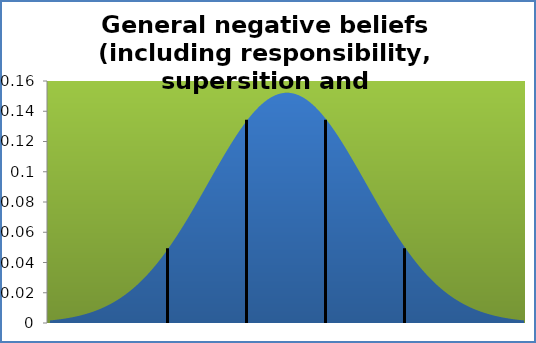
| Category | Series 1 |
|---|---|
| 0.47999999999999865 | 0.002 |
| 0.6109999999999989 | 0.002 |
| 0.7419999999999991 | 0.002 |
| 0.8729999999999993 | 0.003 |
| 1.0039999999999996 | 0.003 |
| 1.1349999999999998 | 0.003 |
| 1.2659999999999991 | 0.004 |
| 1.3969999999999994 | 0.005 |
| 1.5279999999999996 | 0.005 |
| 1.6589999999999998 | 0.006 |
| 1.79 | 0.007 |
| 1.9210000000000003 | 0.008 |
| 2.0519999999999996 | 0.009 |
| 2.183 | 0.01 |
| 2.313999999999999 | 0.011 |
| 2.4449999999999994 | 0.012 |
| 2.5759999999999996 | 0.014 |
| 2.706999999999999 | 0.015 |
| 2.837999999999999 | 0.017 |
| 2.9689999999999994 | 0.019 |
| 3.0999999999999996 | 0.021 |
| 3.231 | 0.023 |
| 3.362 | 0.025 |
| 3.4930000000000003 | 0.028 |
| 3.6239999999999997 | 0.03 |
| 3.755 | 0.033 |
| 3.886 | 0.036 |
| 4.0169999999999995 | 0.039 |
| 4.148 | 0.042 |
| 4.279 | 0.046 |
| 4.409999999999999 | 0.049 |
| 4.5409999999999995 | 0.053 |
| 4.672 | 0.057 |
| 4.802999999999999 | 0.061 |
| 4.933999999999999 | 0.065 |
| 5.0649999999999995 | 0.07 |
| 5.196 | 0.074 |
| 5.327 | 0.079 |
| 5.458 | 0.083 |
| 5.5889999999999995 | 0.088 |
| 5.72 | 0.092 |
| 5.851 | 0.097 |
| 5.981999999999999 | 0.102 |
| 6.1129999999999995 | 0.106 |
| 6.244 | 0.111 |
| 6.375 | 0.115 |
| 6.506 | 0.119 |
| 6.637 | 0.123 |
| 6.768 | 0.127 |
| 6.899 | 0.131 |
| 7.029999999999999 | 0.134 |
| 7.161 | 0.138 |
| 7.292 | 0.141 |
| 7.423 | 0.143 |
| 7.554 | 0.146 |
| 7.685 | 0.148 |
| 7.816 | 0.149 |
| 7.947 | 0.151 |
| 8.078 | 0.152 |
| 8.209 | 0.152 |
| 8.34 | 0.152 |
| 8.471 | 0.152 |
| 8.602 | 0.152 |
| 8.733 | 0.151 |
| 8.864 | 0.149 |
| 8.995 | 0.148 |
| 9.126 | 0.146 |
| 9.257 | 0.143 |
| 9.388 | 0.141 |
| 9.519 | 0.138 |
| 9.65 | 0.134 |
| 9.781 | 0.131 |
| 9.911999999999999 | 0.127 |
| 10.043 | 0.123 |
| 10.174 | 0.119 |
| 10.305 | 0.115 |
| 10.436 | 0.111 |
| 10.567 | 0.106 |
| 10.698 | 0.102 |
| 10.829 | 0.097 |
| 10.96 | 0.092 |
| 11.091000000000001 | 0.088 |
| 11.222 | 0.083 |
| 11.353 | 0.079 |
| 11.484 | 0.074 |
| 11.615 | 0.07 |
| 11.746 | 0.065 |
| 11.877 | 0.061 |
| 12.008 | 0.057 |
| 12.139 | 0.053 |
| 12.27 | 0.049 |
| 12.401 | 0.046 |
| 12.532 | 0.042 |
| 12.663 | 0.039 |
| 12.794 | 0.036 |
| 12.925 | 0.033 |
| 13.056000000000001 | 0.03 |
| 13.187 | 0.028 |
| 13.318 | 0.025 |
| 13.449 | 0.023 |
| 13.58 | 0.021 |
| 13.711 | 0.019 |
| 13.842 | 0.017 |
| 13.973 | 0.015 |
| 14.104 | 0.014 |
| 14.235 | 0.012 |
| 14.366 | 0.011 |
| 14.497 | 0.01 |
| 14.628 | 0.009 |
| 14.759 | 0.008 |
| 14.89 | 0.007 |
| 15.021 | 0.006 |
| 15.152000000000001 | 0.005 |
| 15.283000000000001 | 0.005 |
| 15.414000000000001 | 0.004 |
| 15.545 | 0.003 |
| 15.676 | 0.003 |
| 15.807 | 0.003 |
| 15.938 | 0.002 |
| 16.069000000000003 | 0.002 |
| 16.200000000000003 | 0.002 |